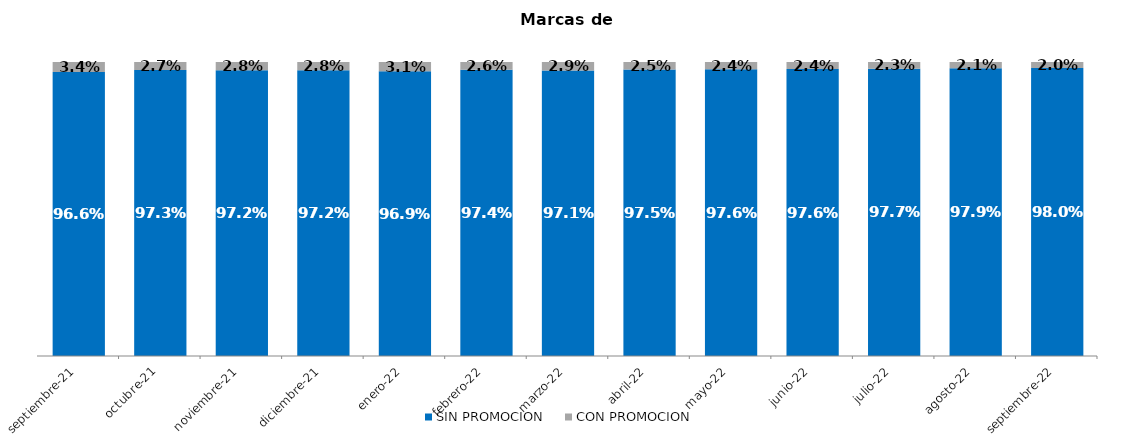
| Category | SIN PROMOCION   | CON PROMOCION   |
|---|---|---|
| 2021-09-01 | 0.966 | 0.034 |
| 2021-10-01 | 0.973 | 0.027 |
| 2021-11-01 | 0.972 | 0.028 |
| 2021-12-01 | 0.972 | 0.028 |
| 2022-01-01 | 0.969 | 0.031 |
| 2022-02-01 | 0.974 | 0.026 |
| 2022-03-01 | 0.971 | 0.029 |
| 2022-04-01 | 0.975 | 0.025 |
| 2022-05-01 | 0.976 | 0.024 |
| 2022-06-01 | 0.976 | 0.024 |
| 2022-07-01 | 0.977 | 0.023 |
| 2022-08-01 | 0.979 | 0.021 |
| 2022-09-01 | 0.98 | 0.02 |